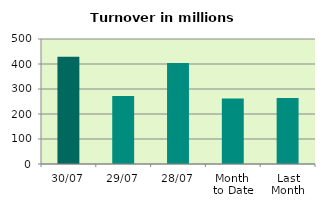
| Category | Series 0 |
|---|---|
| 30/07 | 428.747 |
| 29/07 | 272.212 |
| 28/07 | 403.603 |
| Month 
to Date | 262.308 |
| Last
Month | 264.074 |